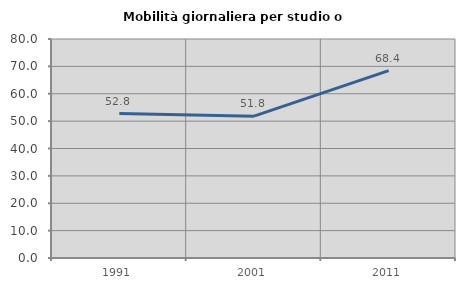
| Category | Mobilità giornaliera per studio o lavoro |
|---|---|
| 1991.0 | 52.763 |
| 2001.0 | 51.825 |
| 2011.0 | 68.421 |